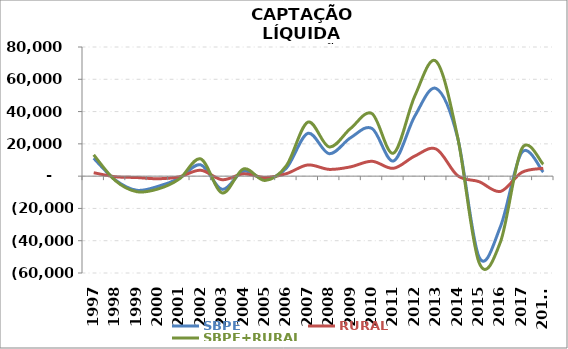
| Category | SBPE | RURAL | SBPE+RURAL |
|---|---|---|---|
| 1997 | 11079 | 2113.852 | 13192.852 |
| 1998 | -2301.5 | -361.228 | -2662.728 |
| 1999 | -8740.2 | -858.508 | -9598.708 |
| 2000 | -6355.964 | -1615.457 | -7971.421 |
| 2001 | -1319.381 | -412.963 | -1732.344 |
| 2002 | 7008.282 | 3649.972 | 10658.254 |
| 2003 | -8178.886 | -2213.868 | -10392.754 |
| 2004 | 3057.299 | 1425.147 | 4482.446 |
| 2005 | -1869.531 | -826.948 | -2696.479 |
| 2006 | 4963.736 | 1532.919 | 6496.655 |
| 2007 | 26493.6 | 6927.358 | 33420.958 |
| 2008 | 13900.71 | 4187.043 | 18087.753 |
| 2009 | 23813.033 | 5752.651 | 29565.684 |
| 2010 | 29513.472 | 9213.301 | 38726.773 |
| 2011 | 9382.932 | 4844.657 | 14227.589 |
| 2012 | 37239.575 | 12479.984 | 49719.559 |
| 2013 | 54280.749 | 16766.843 | 71047.592 |
| 2014 | 23758.558 | 275.423 | 24033.981 |
| 2015 | -50149.363 | -3418.504 | -53567.867 |
| 2016 | -31222.546 | -9479.207 | -40701.753 |
| 2017 | 14774.799 | 2351.903 | 17126.702 |
| 2018* | 2504.228 | 4845.359 | 7349.587 |